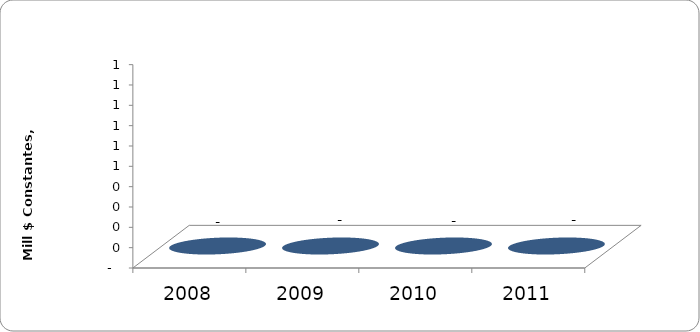
| Category | SALDO DE DEUDA FINANCIERA |
|---|---|
| 2008.0 | 0 |
| 2009.0 | 0 |
| 2010.0 | 0 |
| 2011.0 | 0 |